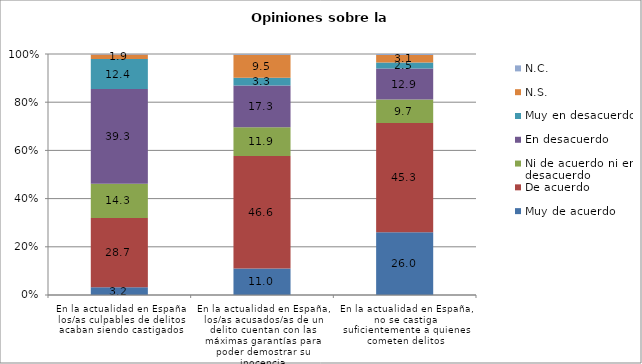
| Category | Muy de acuerdo | De acuerdo | Ni de acuerdo ni en desacuerdo | En desacuerdo | Muy en desacuerdo | N.S.  | N.C.  |
|---|---|---|---|---|---|---|---|
| En la actualidad en España los/as culpables de delitos acaban siendo castigados | 3.2 | 28.7 | 14.3 | 39.3 | 12.4 | 1.9 | 0.2 |
| En la actualidad en España, los/as acusados/as de un delito cuentan con las máximas garantías para poder demostrar su inocencia | 11 | 46.6 | 11.9 | 17.3 | 3.3 | 9.5 | 0.3 |
| En la actualidad en España, no se castiga suficientemente a quienes cometen delitos | 26 | 45.3 | 9.7 | 12.9 | 2.5 | 3.1 | 0.4 |